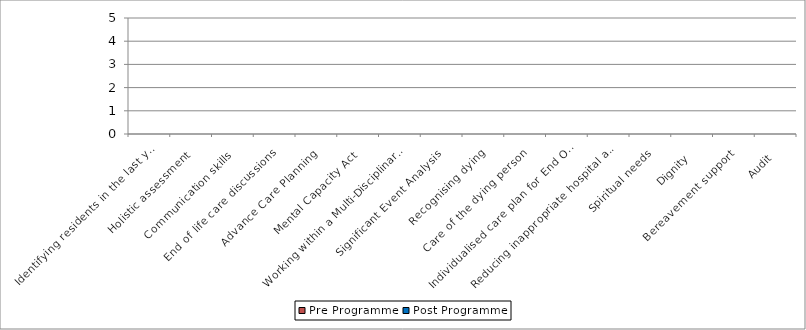
| Category | Pre Programme | Post Programme |
|---|---|---|
| Identifying residents in the last year of life | 0 | 0 |
| Holistic assessment | 0 | 0 |
| Communication skills | 0 | 0 |
| End of life care discussions | 0 | 0 |
| Advance Care Planning | 0 | 0 |
| Mental Capacity Act | 0 | 0 |
| Working within a Multi-Disciplinary Team | 0 | 0 |
| Significant Event Analysis | 0 | 0 |
| Recognising dying | 0 | 0 |
| Care of the dying person | 0 | 0 |
| Individualised care plan for End Of Life | 0 | 0 |
| Reducing inappropriate hospital admissions | 0 | 0 |
| Spiritual needs | 0 | 0 |
| Dignity | 0 | 0 |
| Bereavement support | 0 | 0 |
| Audit | 0 | 0 |